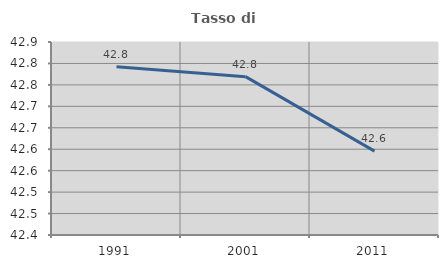
| Category | Tasso di occupazione   |
|---|---|
| 1991.0 | 42.792 |
| 2001.0 | 42.769 |
| 2011.0 | 42.596 |